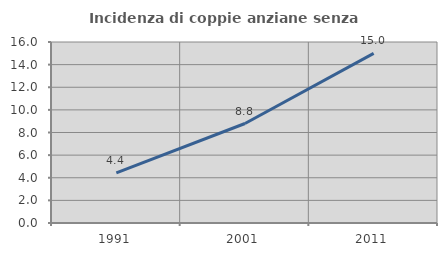
| Category | Incidenza di coppie anziane senza figli  |
|---|---|
| 1991.0 | 4.429 |
| 2001.0 | 8.794 |
| 2011.0 | 14.994 |